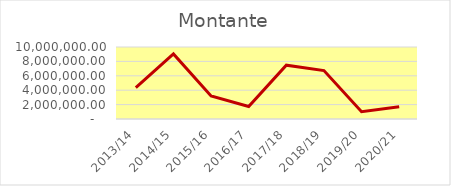
| Category | Montante |
|---|---|
| 2013/14 | 4351618.49 |
| 2014/15 | 9032422.79 |
| 2015/16 | 3200588.78 |
| 2016/17 | 1731311.7 |
| 2017/18 | 7477340.04 |
| 2018/19 | 6722341.07 |
| 2019/20 | 1009266 |
| 2020/21 | 1704100 |